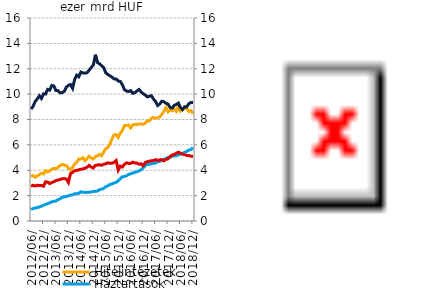
| Category | Hitelintézetek | Háztartások |
|---|---|---|
| 2012-06-30 | 3.522 | 0.913 |
| 2012-07-31 | 3.581 | 0.984 |
| 2012-08-31 | 3.45 | 1.023 |
| 2012-09-30 | 3.547 | 1.06 |
| 2012-10-31 | 3.66 | 1.107 |
| 2012-11-30 | 3.762 | 1.168 |
| 2012-12-31 | 3.703 | 1.246 |
| 2013-01-31 | 3.965 | 1.311 |
| 2013-02-28 | 3.854 | 1.364 |
| 2013-03-31 | 3.951 | 1.436 |
| 2013-04-30 | 4.077 | 1.516 |
| 2013-05-31 | 4.152 | 1.541 |
| 2013-06-30 | 4.122 | 1.58 |
| 2013-07-31 | 4.225 | 1.681 |
| 2013-08-31 | 4.38 | 1.75 |
| 2013-09-30 | 4.46 | 1.872 |
| 2013-10-31 | 4.414 | 1.893 |
| 2013-11-30 | 4.366 | 1.935 |
| 2013-12-31 | 4.145 | 1.991 |
| 2014-01-31 | 4.032 | 2.036 |
| 2014-02-28 | 4.224 | 2.07 |
| 2014-03-31 | 4.491 | 2.148 |
| 2014-04-30 | 4.631 | 2.151 |
| 2014-05-31 | 4.888 | 2.186 |
| 2014-06-30 | 4.883 | 2.301 |
| 2014-07-31 | 4.984 | 2.265 |
| 2014-08-31 | 4.755 | 2.248 |
| 2014-09-30 | 4.91 | 2.27 |
| 2014-10-31 | 5.11 | 2.262 |
| 2014-11-30 | 4.966 | 2.287 |
| 2014-12-31 | 4.888 | 2.333 |
| 2015-01-31 | 5.077 | 2.336 |
| 2015-02-28 | 5.129 | 2.364 |
| 2015-03-31 | 5.259 | 2.472 |
| 2015-04-30 | 5.15 | 2.514 |
| 2015-05-31 | 5.437 | 2.57 |
| 2015-06-30 | 5.703 | 2.704 |
| 2015-07-31 | 5.799 | 2.766 |
| 2015-08-31 | 6.047 | 2.879 |
| 2015-09-30 | 6.487 | 2.922 |
| 2015-10-31 | 6.783 | 2.995 |
| 2015-11-30 | 6.806 | 3.051 |
| 2015-12-31 | 6.583 | 3.16 |
| 2016-01-31 | 6.924 | 3.34 |
| 2016-02-29 | 7.136 | 3.482 |
| 2016-03-31 | 7.526 | 3.506 |
| 2016-04-30 | 7.517 | 3.568 |
| 2016-05-31 | 7.568 | 3.667 |
| 2016-06-30 | 7.337 | 3.726 |
| 2016-07-31 | 7.579 | 3.779 |
| 2016-08-31 | 7.612 | 3.836 |
| 2016-09-30 | 7.589 | 3.888 |
| 2016-10-31 | 7.655 | 3.95 |
| 2016-11-30 | 7.646 | 4.034 |
| 2016-12-31 | 7.618 | 4.179 |
| 2017-01-31 | 7.727 | 4.344 |
| 2017-02-28 | 7.889 | 4.469 |
| 2017-03-31 | 7.879 | 4.451 |
| 2017-04-30 | 8.097 | 4.52 |
| 2017-05-31 | 8.164 | 4.543 |
| 2017-06-30 | 8.095 | 4.566 |
| 2017-07-31 | 8.135 | 4.683 |
| 2017-08-31 | 8.206 | 4.698 |
| 2017-09-30 | 8.405 | 4.767 |
| 2017-10-31 | 8.643 | 4.874 |
| 2017-11-30 | 8.949 | 4.902 |
| 2017-12-31 | 8.613 | 5.025 |
| 2018-01-31 | 8.768 | 5.04 |
| 2018-02-28 | 8.688 | 5.098 |
| 2018-03-31 | 8.833 | 5.132 |
| 2018-04-30 | 8.649 | 5.14 |
| 2018-05-31 | 9.028 | 5.208 |
| 2018-06-30 | 8.647 | 5.282 |
| 2018-07-31 | 8.762 | 5.324 |
| 2018-08-31 | 8.959 | 5.411 |
| 2018-09-30 | 8.866 | 5.484 |
| 2018-10-31 | 8.635 | 5.588 |
| 2018-11-30 | 8.7 | 5.625 |
| 2018-12-31 | 8.467 | 5.779 |